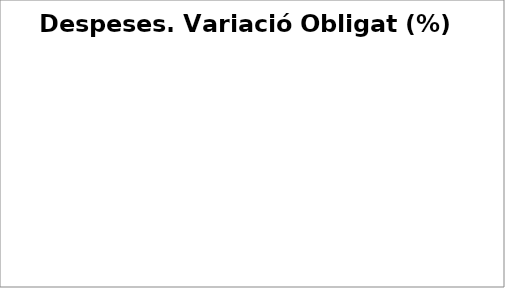
| Category | Series 0 |
|---|---|
| Despeses de personal | 0.002 |
| Despeses en béns corrents i serveis | 0.024 |
| Despeses financeres | -0.273 |
| Transferències corrents | 0.114 |
| Fons de contingència | 0 |
| Inversions reals | 0.622 |
| Transferències de capital | 0.665 |
| Actius financers | -0.204 |
| Passius financers | 0.253 |